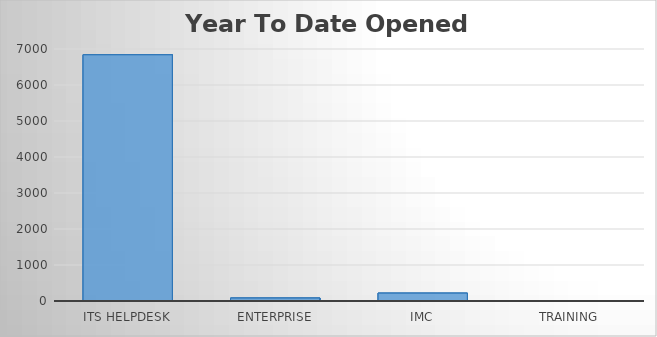
| Category | YTD Opened Tickets |
|---|---|
| 0 | 6841 |
| 1 | 84 |
| 2 | 220 |
| 3 | 12 |